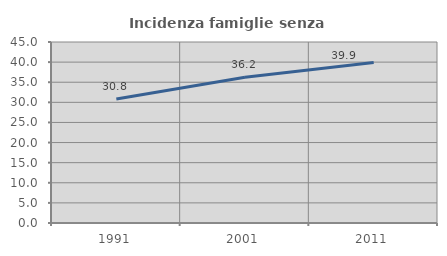
| Category | Incidenza famiglie senza nuclei |
|---|---|
| 1991.0 | 30.811 |
| 2001.0 | 36.224 |
| 2011.0 | 39.896 |